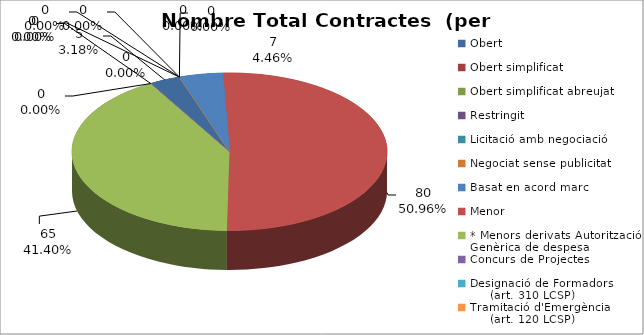
| Category | Nombre Total Contractes |
|---|---|
| Obert | 5 |
| Obert simplificat | 0 |
| Obert simplificat abreujat | 0 |
| Restringit | 0 |
| Licitació amb negociació | 0 |
| Negociat sense publicitat | 0 |
| Basat en acord marc | 7 |
| Menor | 80 |
| * Menors derivats Autorització Genèrica de despesa | 65 |
| Concurs de Projectes | 0 |
| Designació de Formadors
     (art. 310 LCSP) | 0 |
| Tramitació d'Emergència
     (art. 120 LCSP) | 0 |